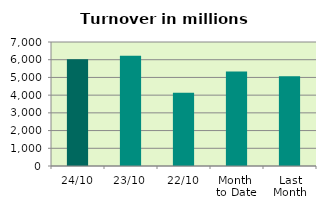
| Category | Series 0 |
|---|---|
| 24/10 | 6030.947 |
| 23/10 | 6222.023 |
| 22/10 | 4133.964 |
| Month 
to Date | 5335.721 |
| Last
Month | 5068.328 |